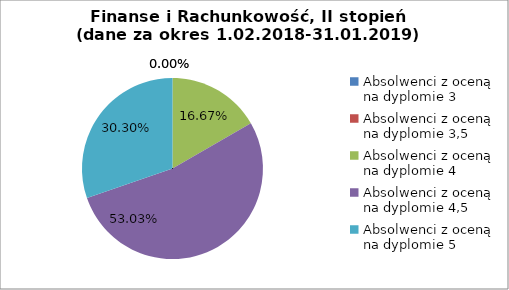
| Category | Series 0 |
|---|---|
| Absolwenci z oceną na dyplomie 3 | 0 |
| Absolwenci z oceną na dyplomie 3,5 | 0 |
| Absolwenci z oceną na dyplomie 4 | 16.667 |
| Absolwenci z oceną na dyplomie 4,5 | 53.03 |
| Absolwenci z oceną na dyplomie 5 | 30.303 |